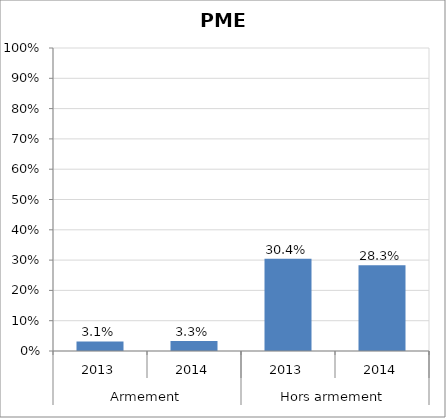
| Category | Part des PME  dans les paiements aux entreprises |
|---|---|
| 0 | 0.031 |
| 1 | 0.033 |
| 2 | 0.304 |
| 3 | 0.283 |